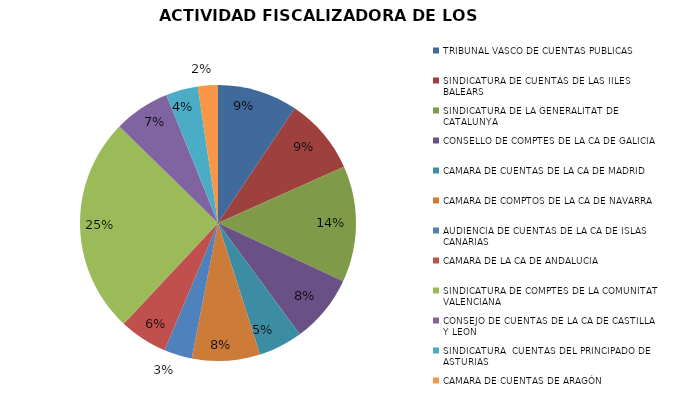
| Category | Series 0 |
|---|---|
| TRIBUNAL VASCO DE CUENTAS PUBLICAS | 20 |
| SINDICATURA DE CUENTAS DE LAS IILES BALEARS | 19 |
| SINDICATURA DE LA GENERALITAT DE CATALUNYA | 29 |
| CONSELLO DE COMPTES DE LA CA DE GALICIA | 17 |
| CAMARA DE CUENTAS DE LA CA DE MADRID | 11 |
| CAMARA DE COMPTOS DE LA CA DE NAVARRA | 17 |
| AUDIENCIA DE CUENTAS DE LA CA DE ISLAS CANARIAS | 7 |
| CAMARA DE LA CA DE ANDALUCIA | 12 |
| SINDICATURA DE COMPTES DE LA COMUNITAT VALENCIANA | 54 |
| CONSEJO DE CUENTAS DE LA CA DE CASTILLA Y LEON | 14 |
| SINDICATURA  CUENTAS DEL PRINCIPADO DE ASTURIAS | 8 |
| CAMARA DE CUENTAS DE ARAGÓN | 5 |